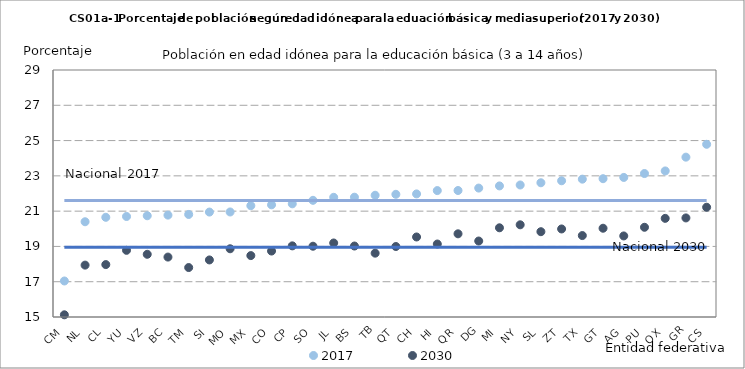
| Category | 2017 | 2030 | N_17 | N_30 |
|---|---|---|---|---|
| CM | 17.041 | 15.126 | 21.6 | 18.953 |
| NL | 20.398 | 17.941 | 21.6 | 18.953 |
| CL | 20.651 | 17.971 | 21.6 | 18.953 |
| YU | 20.697 | 18.78 | 21.6 | 18.953 |
| VZ | 20.739 | 18.554 | 21.6 | 18.953 |
| BC | 20.775 | 18.397 | 21.6 | 18.953 |
| TM | 20.812 | 17.803 | 21.6 | 18.953 |
| SI | 20.947 | 18.234 | 21.6 | 18.953 |
| MO | 20.953 | 18.867 | 21.6 | 18.953 |
| MX | 21.308 | 18.481 | 21.6 | 18.953 |
| CO | 21.359 | 18.738 | 21.6 | 18.953 |
| CP | 21.415 | 19.033 | 21.6 | 18.953 |
| SO | 21.614 | 19.012 | 21.6 | 18.953 |
| JL | 21.784 | 19.195 | 21.6 | 18.953 |
| BS | 21.79 | 19.023 | 21.6 | 18.953 |
| TB | 21.9 | 18.618 | 21.6 | 18.953 |
| QT | 21.954 | 18.996 | 21.6 | 18.953 |
| CH | 21.977 | 19.536 | 21.6 | 18.953 |
| HI | 22.165 | 19.136 | 21.6 | 18.953 |
| QR | 22.169 | 19.714 | 21.6 | 18.953 |
| DG | 22.307 | 19.307 | 21.6 | 18.953 |
| MI | 22.43 | 20.057 | 21.6 | 18.953 |
| NY | 22.482 | 20.226 | 21.6 | 18.953 |
| SL | 22.608 | 19.835 | 21.6 | 18.953 |
| ZT | 22.721 | 19.99 | 21.6 | 18.953 |
| TX | 22.813 | 19.616 | 21.6 | 18.953 |
| GT | 22.839 | 20.032 | 21.6 | 18.953 |
| AG | 22.911 | 19.594 | 21.6 | 18.953 |
| PU | 23.132 | 20.085 | 21.6 | 18.953 |
| OX | 23.279 | 20.591 | 21.6 | 18.953 |
| GR | 24.06 | 20.615 | 21.6 | 18.953 |
| CS | 24.789 | 21.221 | 21.6 | 18.953 |